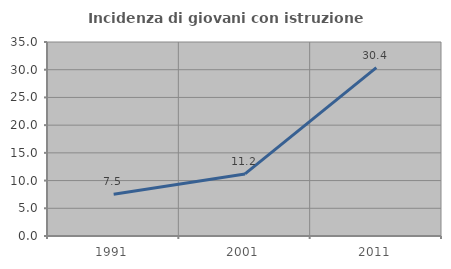
| Category | Incidenza di giovani con istruzione universitaria |
|---|---|
| 1991.0 | 7.534 |
| 2001.0 | 11.194 |
| 2011.0 | 30.38 |